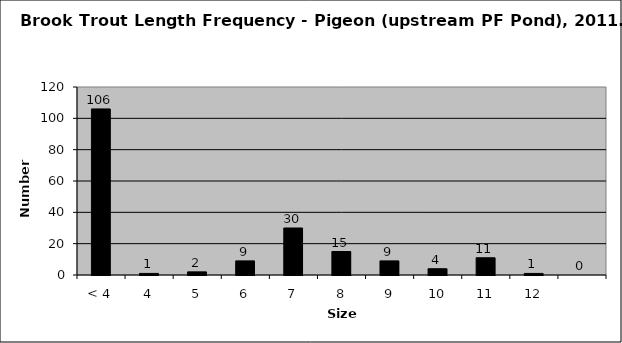
| Category | Series 0 |
|---|---|
| < 4 | 106 |
| 4 | 1 |
| 5 | 2 |
| 6 | 9 |
| 7 | 30 |
| 8 | 15 |
| 9 | 9 |
| 10 | 4 |
| 11 | 11 |
| 12 | 1 |